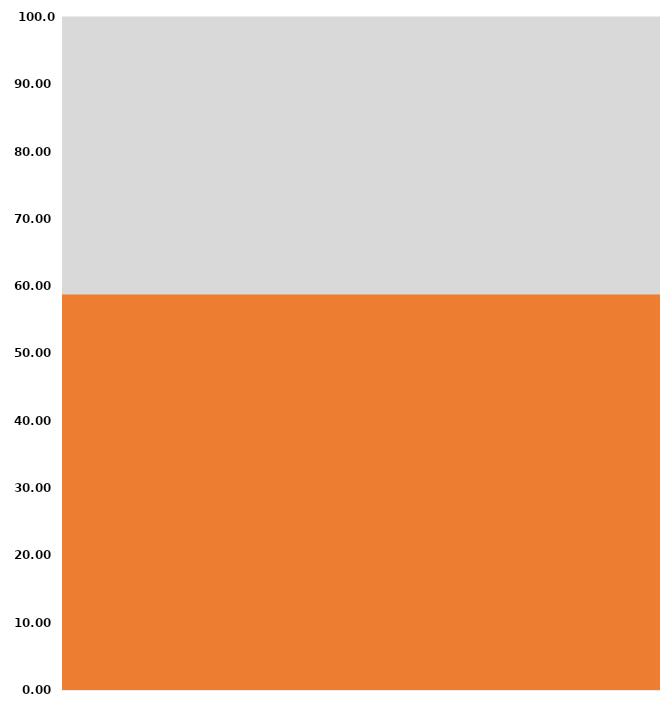
| Category | Goal |
|---|---|
| 0 | 100 |